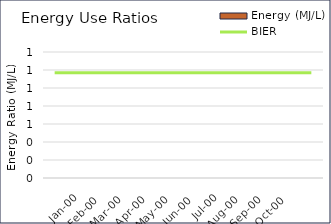
| Category | Energy (MJ/L) |
|---|---|
| 0.0 | 0 |
| 1900-01-31 | 0 |
| 1900-02-28 | 0 |
| 1900-03-28 | 0 |
| 1900-04-28 | 0 |
| 1900-05-28 | 0 |
| 1900-06-28 | 0 |
| 1900-07-28 | 0 |
| 1900-08-28 | 0 |
| 1900-09-28 | 0 |
| 1900-10-28 | 0 |
| 1900-11-28 | 0 |